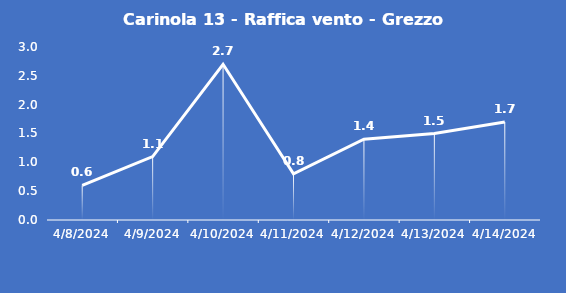
| Category | Carinola 13 - Raffica vento - Grezzo (m/s) |
|---|---|
| 4/8/24 | 0.6 |
| 4/9/24 | 1.1 |
| 4/10/24 | 2.7 |
| 4/11/24 | 0.8 |
| 4/12/24 | 1.4 |
| 4/13/24 | 1.5 |
| 4/14/24 | 1.7 |